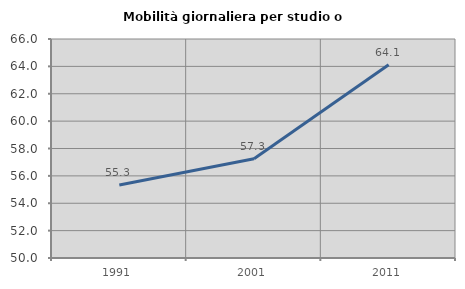
| Category | Mobilità giornaliera per studio o lavoro |
|---|---|
| 1991.0 | 55.329 |
| 2001.0 | 57.257 |
| 2011.0 | 64.125 |